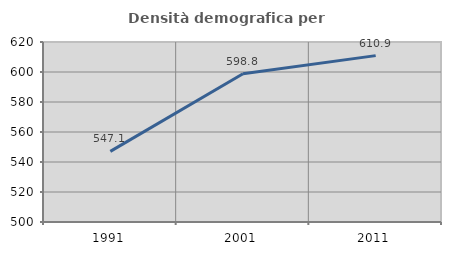
| Category | Densità demografica |
|---|---|
| 1991.0 | 547.106 |
| 2001.0 | 598.781 |
| 2011.0 | 610.909 |